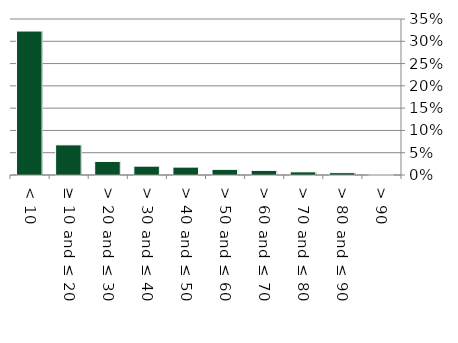
| Category | Native |
|---|---|
| < 10 | 0.323 |
| ≥ 10 and ≤ 20 | 0.068 |
| > 20 and ≤ 30 | 0.03 |
| > 30 and ≤ 40 | 0.02 |
| > 40 and ≤ 50 | 0.018 |
| > 50 and ≤ 60 | 0.013 |
| > 60 and ≤ 70 | 0.01 |
| > 70 and ≤ 80 | 0.007 |
| > 80 and ≤ 90 | 0.005 |
| > 90 | 0.001 |